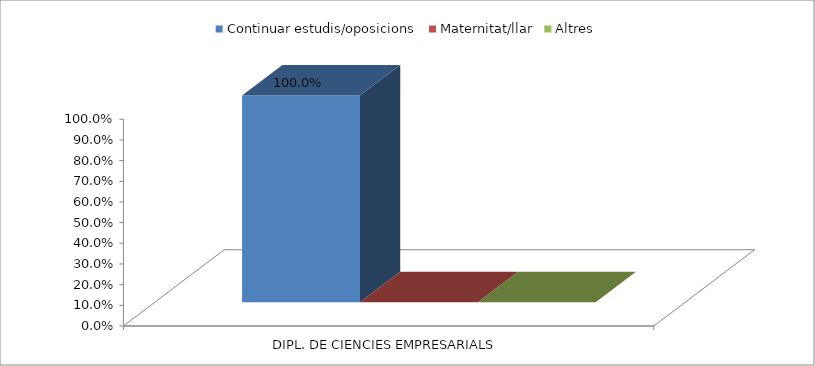
| Category | Continuar estudis/oposicions | Maternitat/llar | Altres |
|---|---|---|---|
| DIPL. DE CIENCIES EMPRESARIALS | 1 | 0 | 0 |